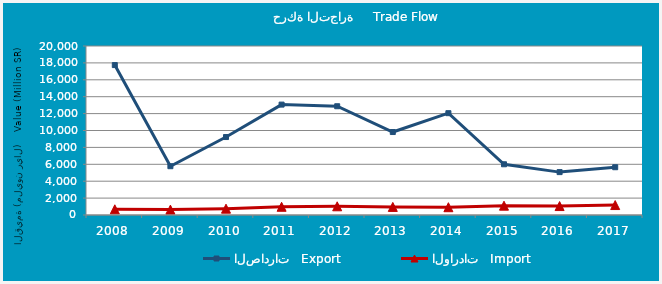
| Category | الصادرات   Export | الواردات   Import |
|---|---|---|
| 2008.0 | 17741800063 | 676013977 |
| 2009.0 | 5773469192 | 639666020 |
| 2010.0 | 9225763121 | 749702614 |
| 2011.0 | 13064417923 | 971814953 |
| 2012.0 | 12869968946 | 1030288842 |
| 2013.0 | 9818477808 | 957638426 |
| 2014.0 | 12049905492 | 921790514 |
| 2015.0 | 6003817733 | 1103973735 |
| 2016.0 | 5075331815 | 1059370888 |
| 2017.0 | 5654349323 | 1177697115 |